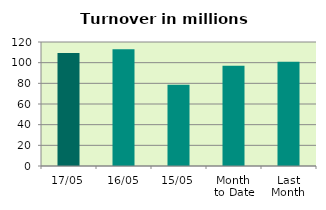
| Category | Series 0 |
|---|---|
| 17/05 | 109.38 |
| 16/05 | 112.91 |
| 15/05 | 78.709 |
| Month 
to Date | 97.063 |
| Last
Month | 100.792 |